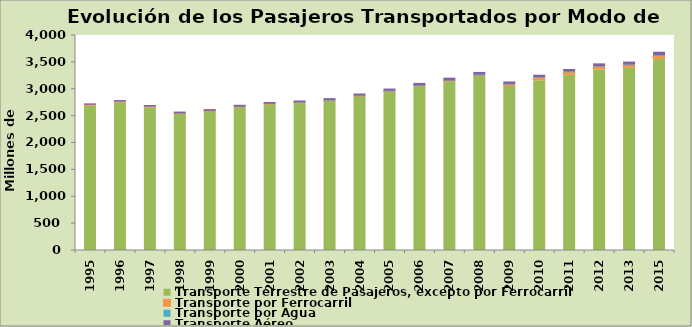
| Category | Transporte Terrestre de Pasajeros, excepto por Ferrocarril | Transporte por Ferrocarril | Transporte por Agua | Transporte Aéreo |
|---|---|---|---|---|
| 1995.0 | 2691 | 6.678 | 5.098 | 25.192 |
| 1996.0 | 2750 | 6.727 | 6.394 | 26.493 |
| 1997.0 | 2658 | 5.092 | 6.228 | 28.896 |
| 1998.0 | 2536 | 1.576 | 7.179 | 30.922 |
| 1999.0 | 2580 | 0.801 | 7.854 | 32.662 |
| 2000.0 | 2660 | 0.334 | 7.4 | 33.974 |
| 2001.0 | 2713 | 0.242 | 7.507 | 33.673 |
| 2002.0 | 2740 | 0.237 | 8.715 | 33.19 |
| 2003.0 | 2780 | 0.27 | 9.843 | 35.287 |
| 2004.0 | 2860 | 0.253 | 11.744 | 39.422 |
| 2005.0 | 2950 | 0.253 | 11.461 | 42.176 |
| 2006.0 | 3050 | 0.26 | 11.985 | 46.705 |
| 2007.0 | 3141 | 0.288 | 12.761 | 52.217 |
| 2008.0 | 3238 | 8.915 | 12.597 | 53.3 |
| 2009.0 | 3050 | 28 | 10.985 | 46.971 |
| 2010.0 | 3160 | 40.398 | 11.793 | 48.698 |
| 2011.0 | 3264.3 | 41.922 | 10.814 | 50.764 |
| 2012.0 | 3363 | 43.83 | 10.268 | 55.153 |
| 2013.0 | 3391 | 45.288 | 9.969 | 60.007 |
| 2015.0 | 3558 | 50.057 | 12.433 | 68.358 |